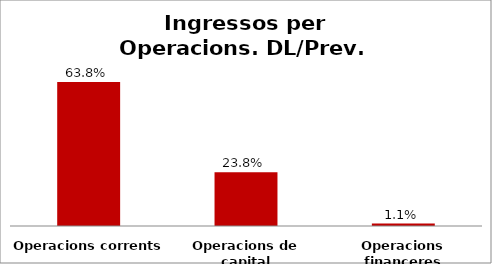
| Category | Series 0 |
|---|---|
| Operacions corrents | 0.638 |
| Operacions de capital | 0.238 |
| Operacions financeres | 0.011 |